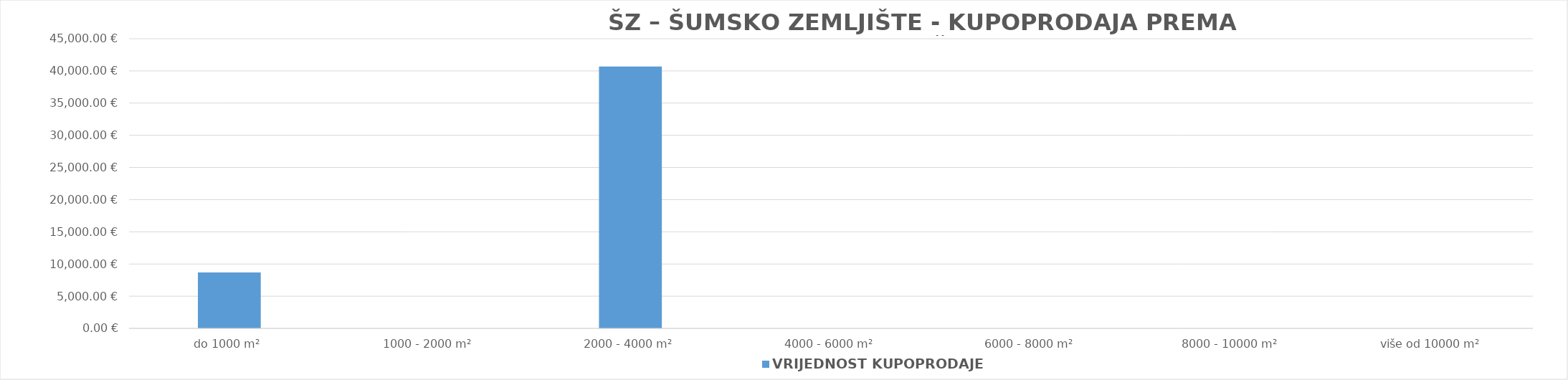
| Category | VRIJEDNOST KUPOPRODAJE 
(u EUR) |
|---|---|
| do 1000 m² | 8675.171 |
| 1000 - 2000 m² | 0 |
| 2000 - 4000 m² | 40686.057 |
| 4000 - 6000 m² | 0 |
| 6000 - 8000 m² | 0 |
| 8000 - 10000 m² | 0 |
| više od 10000 m² | 0 |